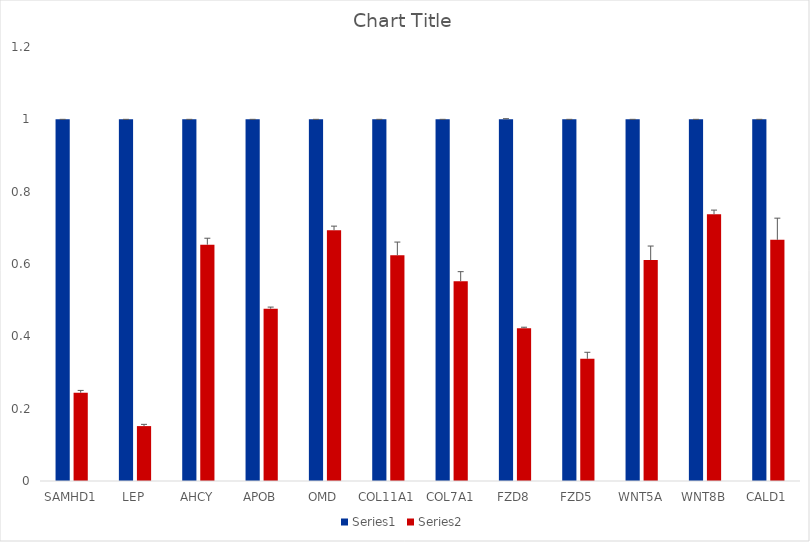
| Category | Series 0 | Series 1 |
|---|---|---|
| SAMHD1 | 1 | 0.244 |
| LEP | 1 | 0.152 |
| AHCY | 1 | 0.653 |
| APOB | 1 | 0.476 |
| OMD | 1 | 0.694 |
| COL11A1 | 1 | 0.624 |
| COL7A1 | 1 | 0.552 |
| FZD8 | 1 | 0.423 |
| FZD5 | 1 | 0.338 |
| WNT5A | 1 | 0.611 |
| WNT8B | 1 | 0.738 |
| CALD1 | 1 | 0.667 |